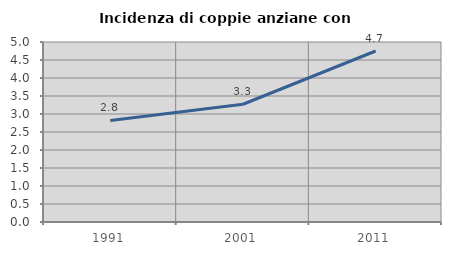
| Category | Incidenza di coppie anziane con figli |
|---|---|
| 1991.0 | 2.822 |
| 2001.0 | 3.271 |
| 2011.0 | 4.75 |